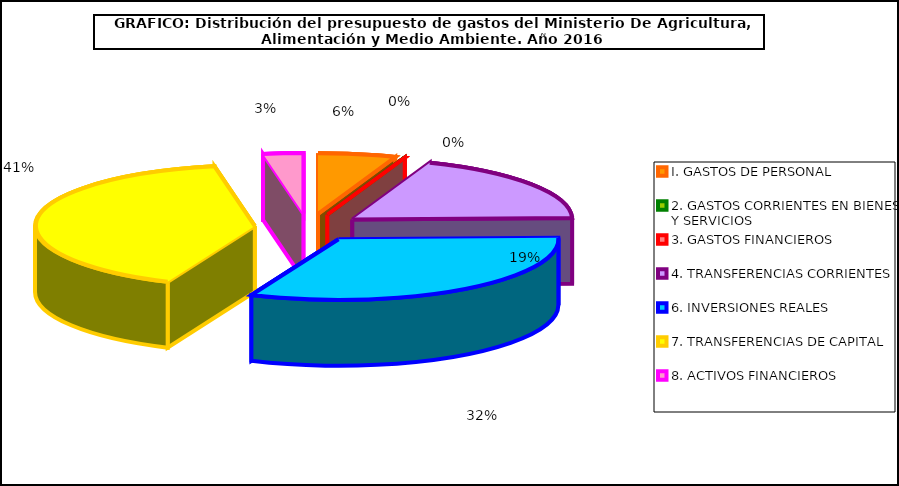
| Category | I. GASTOS DE PERSONAL 2. GASTOS CORRIENTES EN BIENES Y SERVICIOS 3. GASTOS FINANCIEROS 4. TRANSFERENCIAS CORRIENTES 6. INVERSIONES REALES 7. TRANSFERENCIAS DE CAPITAL 8. ACTIVOS FINANCIEROS |
|---|---|
| I. GASTOS DE PERSONAL | 29166010 |
| 2. GASTOS CORRIENTES EN BIENES Y SERVICIOS | 0 |
| 3. GASTOS FINANCIEROS | 55500 |
| 4. TRANSFERENCIAS CORRIENTES | 96409890 |
| 6. INVERSIONES REALES | 162709690 |
| 7. TRANSFERENCIAS DE CAPITAL | 207104230 |
| 8. ACTIVOS FINANCIEROS | 15001270 |